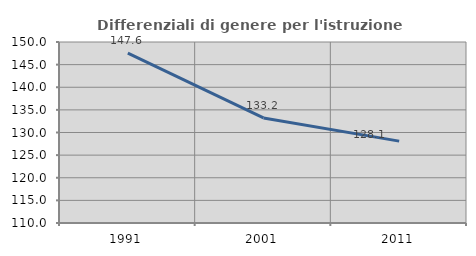
| Category | Differenziali di genere per l'istruzione superiore |
|---|---|
| 1991.0 | 147.55 |
| 2001.0 | 133.212 |
| 2011.0 | 128.096 |